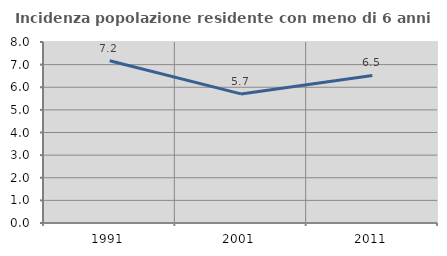
| Category | Incidenza popolazione residente con meno di 6 anni |
|---|---|
| 1991.0 | 7.172 |
| 2001.0 | 5.705 |
| 2011.0 | 6.522 |